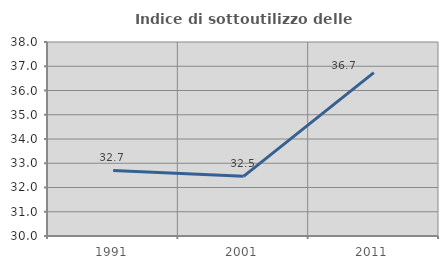
| Category | Indice di sottoutilizzo delle abitazioni  |
|---|---|
| 1991.0 | 32.701 |
| 2001.0 | 32.461 |
| 2011.0 | 36.735 |